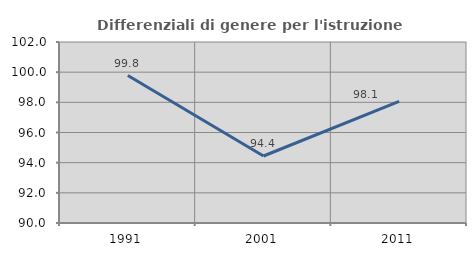
| Category | Differenziali di genere per l'istruzione superiore |
|---|---|
| 1991.0 | 99.776 |
| 2001.0 | 94.443 |
| 2011.0 | 98.061 |